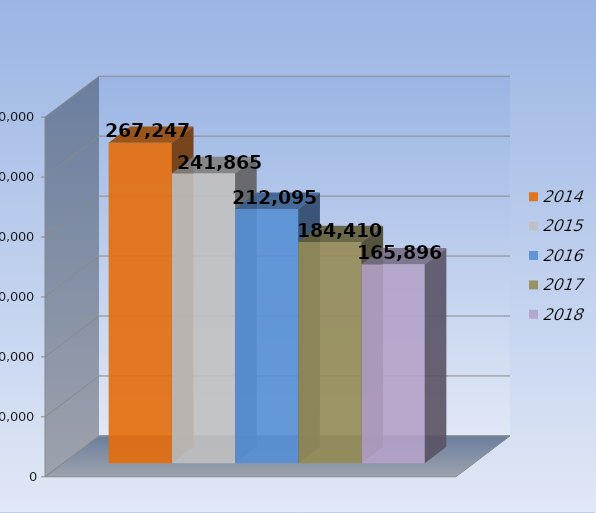
| Category | 2014 | 2015 | 2016 | 2017 | 2018 |
|---|---|---|---|---|---|
| 0 | 267247 | 241865 | 212095 | 184410 | 165896 |